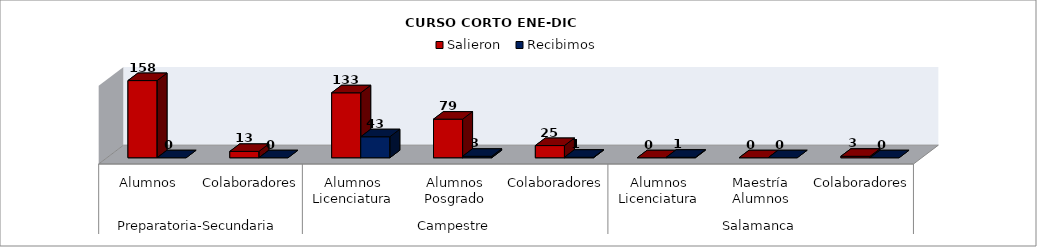
| Category | Salieron  | Recibimos |
|---|---|---|
| 0 | 158 | 0 |
| 1 | 13 | 0 |
| 2 | 133 | 43 |
| 3 | 79 | 3 |
| 4 | 25 | 1 |
| 5 | 0 | 1 |
| 6 | 0 | 0 |
| 7 | 3 | 0 |